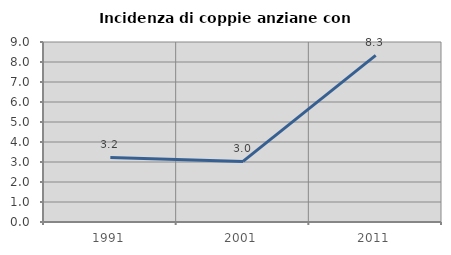
| Category | Incidenza di coppie anziane con figli |
|---|---|
| 1991.0 | 3.226 |
| 2001.0 | 3.03 |
| 2011.0 | 8.333 |